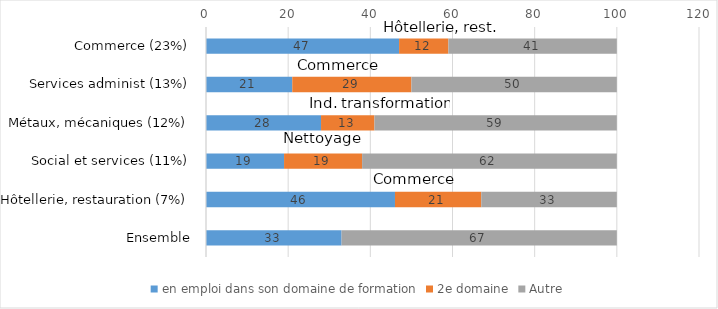
| Category | en emploi dans son domaine de formation | 2e domaine | Autre |
|---|---|---|---|
| Commerce (23%) | 47 | 12 | 41 |
| Services administ (13%) | 21 | 29 | 50 |
| Métaux, mécaniques (12%) | 28 | 13 | 59 |
| Social et services (11%) | 19 | 19 | 62 |
| Hôtellerie, restauration (7%) | 46 | 21 | 33 |
| Ensemble | 33 | 0 | 67 |